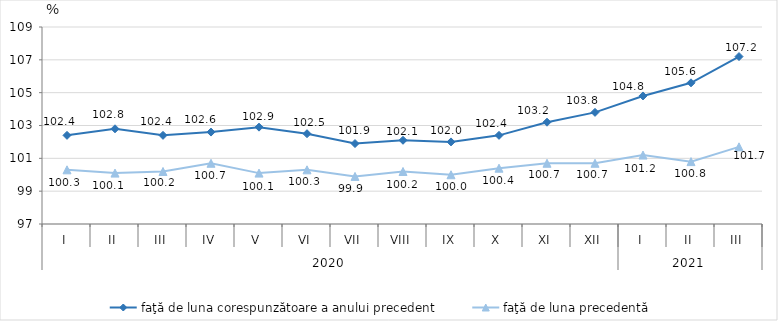
| Category | faţă de luna corespunzătoare a anului precedent | faţă de luna precedentă   |
|---|---|---|
| 0 | 102.4 | 100.3 |
| 1 | 102.8 | 100.1 |
| 2 | 102.4 | 100.2 |
| 3 | 102.6 | 100.7 |
| 4 | 102.9 | 100.1 |
| 5 | 102.5 | 100.3 |
| 6 | 101.9 | 99.9 |
| 7 | 102.1 | 100.2 |
| 8 | 102 | 100 |
| 9 | 102.4 | 100.4 |
| 10 | 103.2 | 100.7 |
| 11 | 103.8 | 100.7 |
| 12 | 104.8 | 101.2 |
| 13 | 105.6 | 100.8 |
| 14 | 107.2 | 101.7 |